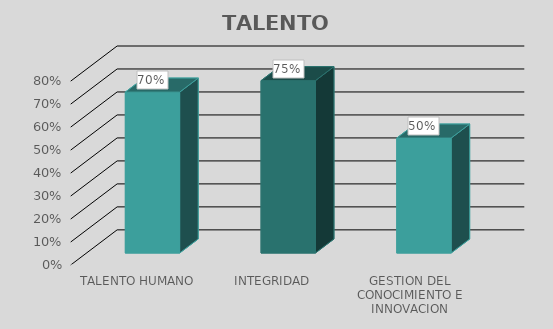
| Category | Series 0 |
|---|---|
| TALENTO HUMANO | 0.7 |
| INTEGRIDAD | 0.75 |
| GESTION DEL CONOCIMIENTO E INNOVACION | 0.5 |